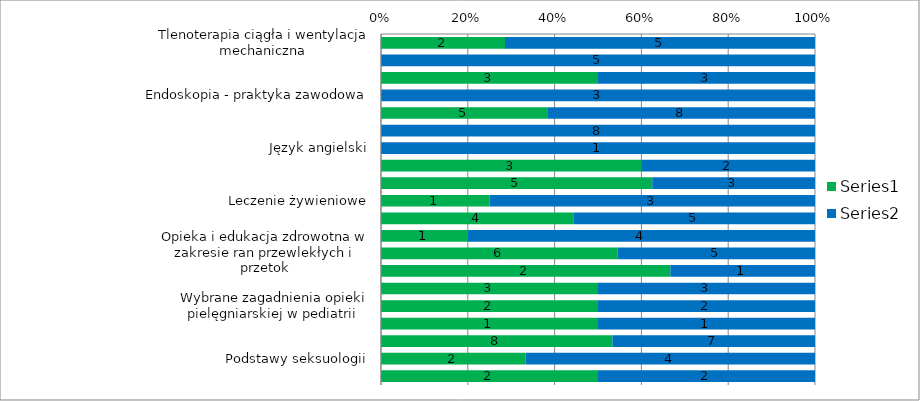
| Category | Series 0 | Series 1 |
|---|---|---|
| Tlenoterapia ciągła i wentylacja mechaniczna | 2 | 5 |
| Tlenoterapia ciągła i wentylacja mechaniczna - praktyka zawodowa | 0 | 5 |
| Endoskopia | 3 | 3 |
| Endoskopia - praktyka zawodowa | 0 | 3 |
| Poradnictwo w pielęgniarstwie | 5 | 8 |
| Poradnictwo w pielęgniarstwie - praktyka zawodowa | 0 | 8 |
| Język angielski | 0 | 1 |
| Dydaktyka medyczna | 3 | 2 |
| Koordynowana opieka zdrowotna | 5 | 3 |
| Leczenie żywieniowe | 1 | 3 |
| Promocja zdrowia i świadczenia profilaktycze | 4 | 5 |
| Opieka i edukacja zdrowotna w chorobach przewlekłych (leczenie p.bólowe) | 1 | 4 |
| Opieka i edukacja zdrowotna w zakresie ran przewlekłych i przetok | 6 | 5 |
| Opieka i edukacja w transplantologii | 2 | 1 |
| Badania naukowe w pielęgniarstwie  | 3 | 3 |
| Wybrane zagadnienia opieki pielęgniarskiej w pediatrii  | 2 | 2 |
| Zajęcia fakultatywne  | 1 | 1 |
| Pielęgniarstwo operacyjne | 8 | 7 |
| Podstawy seksuologii | 2 | 4 |
| Komunikacja z trudnym pacjentem  | 2 | 2 |